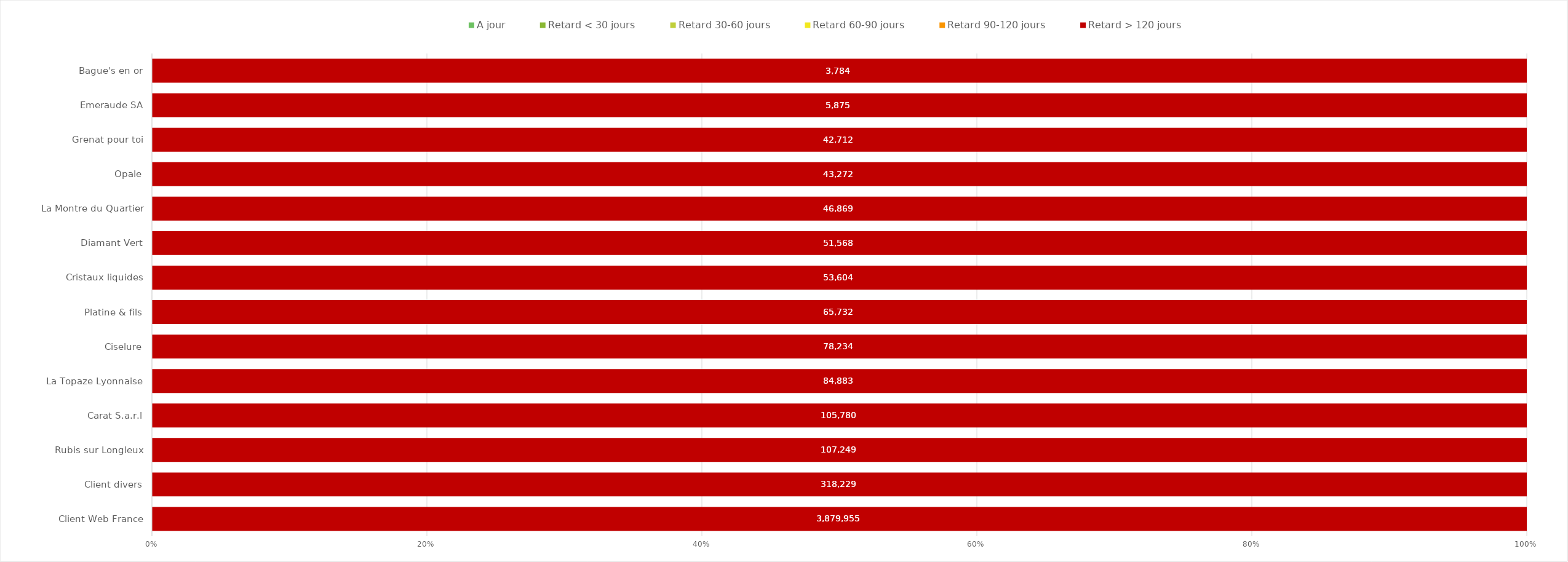
| Category | A jour | Retard < 30 jours | Retard 30-60 jours | Retard 60-90 jours | Retard 90-120 jours | Retard > 120 jours |
|---|---|---|---|---|---|---|
| Client Web France | 0 | 0 | 0 | 0 | 0 | 3879954.55 |
| Client divers | 0 | 0 | 0 | 0 | 0 | 318229.3 |
| Rubis sur Longleux | 0 | 0 | 0 | 0 | 0 | 107249 |
| Carat S.a.r.l | 0 | 0 | 0 | 0 | 0 | 105780.36 |
| La Topaze Lyonnaise | 0 | 0 | 0 | 0 | 0 | 84883.04 |
| Ciselure | 0 | 0 | 0 | 0 | 0 | 78234.06 |
| Platine & fils | 0 | 0 | 0 | 0 | 0 | 65732.16 |
| Cristaux liquides | 0 | 0 | 0 | 0 | 0 | 53604.16 |
| Diamant Vert | 0 | 0 | 0 | 0 | 0 | 51568.26 |
| La Montre du Quartier | 0 | 0 | 0 | 0 | 0 | 46868.67 |
| Opale | 0 | 0 | 0 | 0 | 0 | 43271.84 |
| Grenat pour toi | 0 | 0 | 0 | 0 | 0 | 42711.9 |
| Emeraude SA | 0 | 0 | 0 | 0 | 0 | 5874.68 |
| Bague's en or | 0 | 0 | 0 | 0 | 0 | 3783.66 |